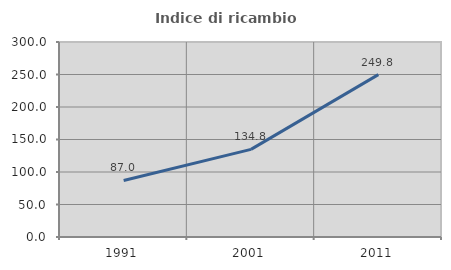
| Category | Indice di ricambio occupazionale  |
|---|---|
| 1991.0 | 87.018 |
| 2001.0 | 134.831 |
| 2011.0 | 249.789 |